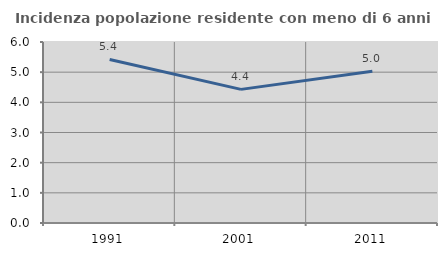
| Category | Incidenza popolazione residente con meno di 6 anni |
|---|---|
| 1991.0 | 5.42 |
| 2001.0 | 4.43 |
| 2011.0 | 5.032 |